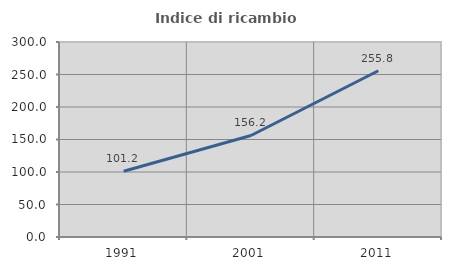
| Category | Indice di ricambio occupazionale  |
|---|---|
| 1991.0 | 101.18 |
| 2001.0 | 156.195 |
| 2011.0 | 255.789 |